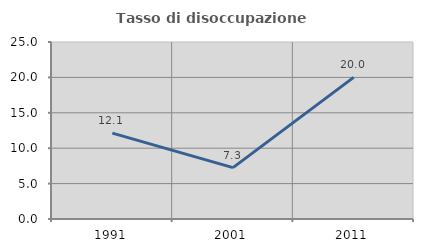
| Category | Tasso di disoccupazione giovanile  |
|---|---|
| 1991.0 | 12.124 |
| 2001.0 | 7.256 |
| 2011.0 | 20 |